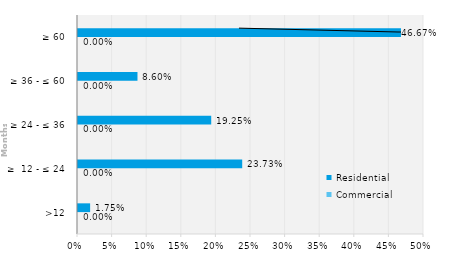
| Category | Commercial | Residential |
|---|---|---|
| >12 | 0 | 0.018 |
| ≥  12 - ≤ 24 | 0 | 0.237 |
| ≥ 24 - ≤ 36 | 0 | 0.193 |
| ≥ 36 - ≤ 60 | 0 | 0.086 |
| ≥ 60 | 0 | 0.467 |